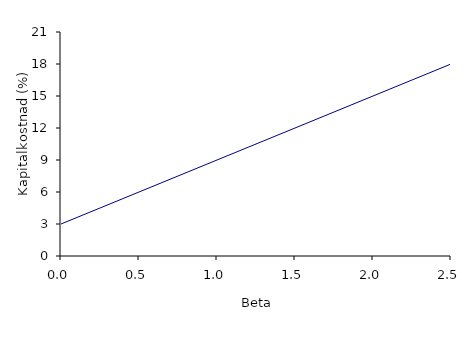
| Category | Series 0 |
|---|---|
| 0.0 | 3 |
| 0.5 | 6 |
| 1.0 | 9 |
| 1.5 | 12 |
| 2.0 | 15 |
| 2.5 | 18 |